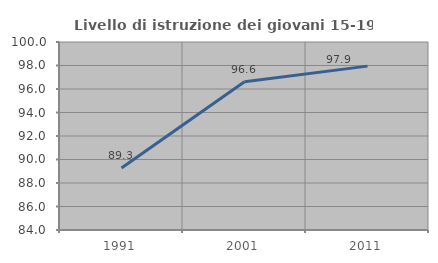
| Category | Livello di istruzione dei giovani 15-19 anni |
|---|---|
| 1991.0 | 89.283 |
| 2001.0 | 96.609 |
| 2011.0 | 97.946 |